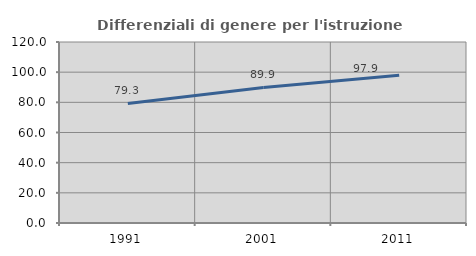
| Category | Differenziali di genere per l'istruzione superiore |
|---|---|
| 1991.0 | 79.286 |
| 2001.0 | 89.853 |
| 2011.0 | 97.878 |